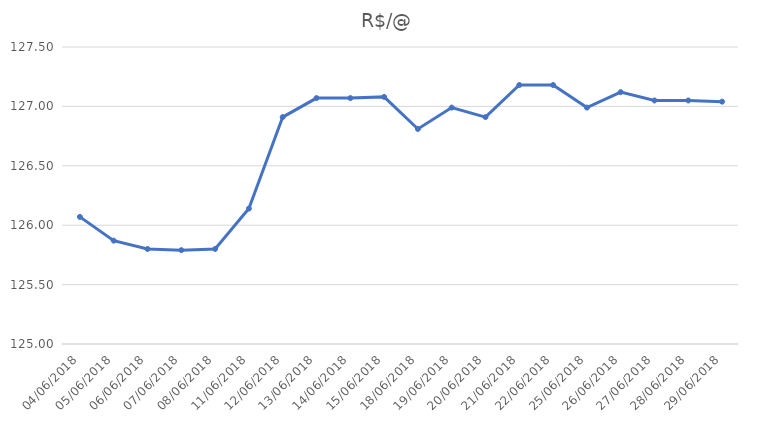
| Category | R$/@ |
|---|---|
| 04/06/2018 | 126.07 |
| 05/06/2018 | 125.87 |
| 06/06/2018 | 125.8 |
| 07/06/2018 | 125.79 |
| 08/06/2018 | 125.8 |
| 11/06/2018 | 126.14 |
| 12/06/2018 | 126.91 |
| 13/06/2018 | 127.07 |
| 14/06/2018 | 127.07 |
| 15/06/2018 | 127.08 |
| 18/06/2018 | 126.81 |
| 19/06/2018 | 126.99 |
| 20/06/2018 | 126.91 |
| 21/06/2018 | 127.18 |
| 22/06/2018 | 127.18 |
| 25/06/2018 | 126.99 |
| 26/06/2018 | 127.12 |
| 27/06/2018 | 127.05 |
| 28/06/2018 | 127.05 |
| 29/06/2018 | 127.04 |